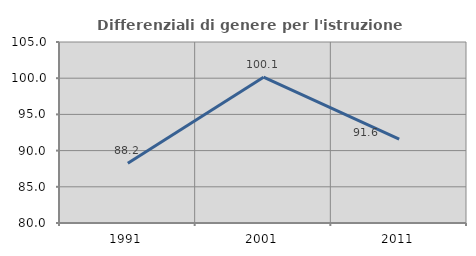
| Category | Differenziali di genere per l'istruzione superiore |
|---|---|
| 1991.0 | 88.246 |
| 2001.0 | 100.139 |
| 2011.0 | 91.589 |